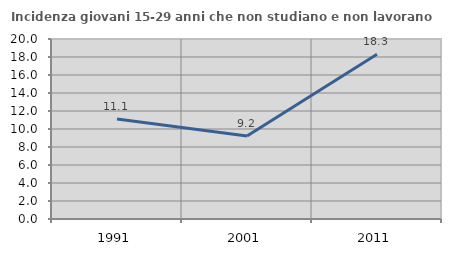
| Category | Incidenza giovani 15-29 anni che non studiano e non lavorano  |
|---|---|
| 1991.0 | 11.111 |
| 2001.0 | 9.225 |
| 2011.0 | 18.31 |